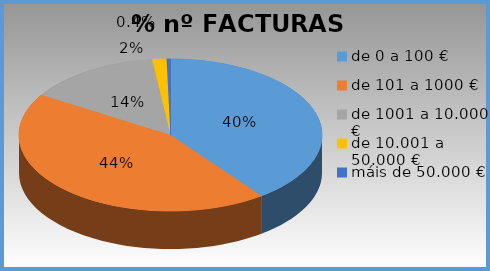
| Category | Series 0 |
|---|---|
| de 0 a 100 € | 0.398 |
| de 101 a 1000 € | 0.44 |
| de 1001 a 10.000 € | 0.143 |
| de 10.001 a 50.000 € | 0.015 |
| máis de 50.000 € | 0.004 |